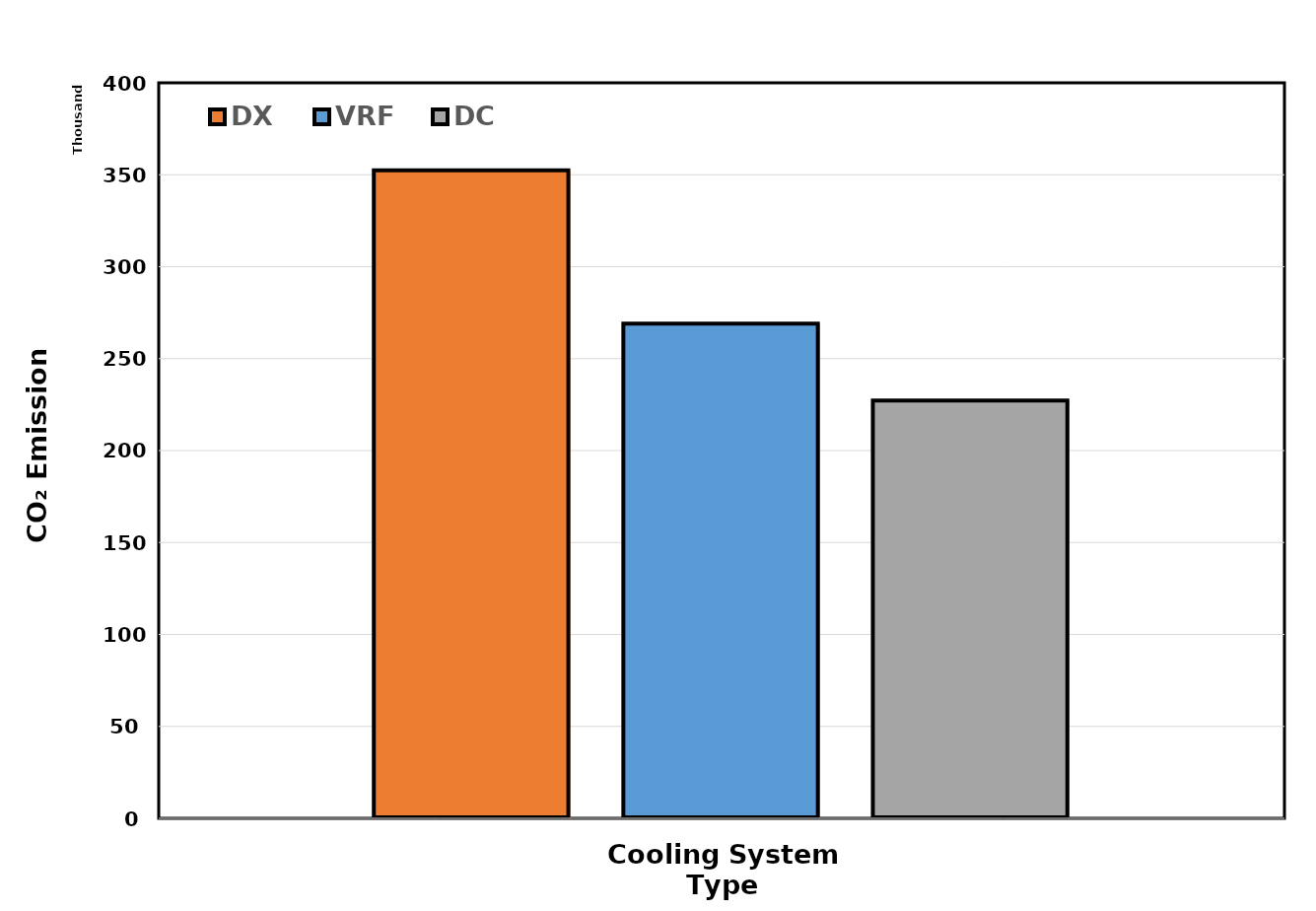
| Category | DX | VRF | DC |
|---|---|---|---|
| 0 | 352468.146 | 269051.85 | 227252.7 |